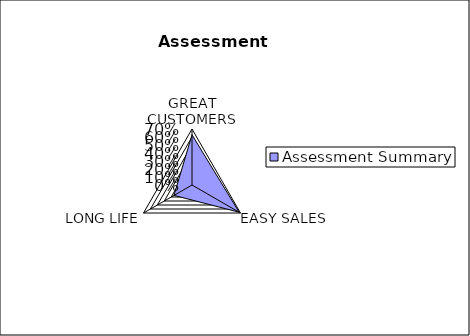
| Category | Assessment Summary |
|---|---|
| GREAT CUSTOMERS | 0.628 |
| EASY SALES | 0.68 |
| LONG LIFE | 0.26 |